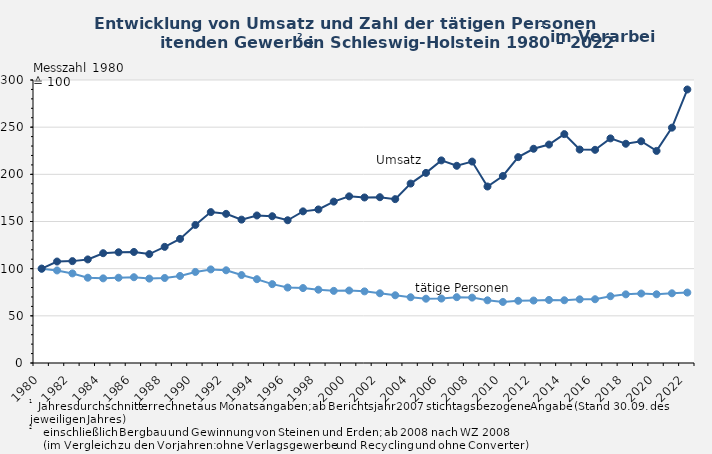
| Category | Tätige Personen1 | Umsatz |
|---|---|---|
| 1980.0 | 100 | 100 |
| 1981.0 | 98.106 | 107.568 |
| 1982.0 | 94.962 | 107.995 |
| 1983.0 | 90.416 | 109.798 |
| 1984.0 | 89.721 | 116.386 |
| 1985.0 | 90.376 | 117.395 |
| 1986.0 | 90.92 | 117.716 |
| 1987.0 | 89.463 | 115.449 |
| 1988.0 | 90.117 | 123.129 |
| 1989.0 | 92.291 | 131.587 |
| 1990.0 | 96.549 | 146.362 |
| 1991.0 | 99.203 | 159.964 |
| 1992.0 | 98.274 | 158.113 |
| 1993.0 | 93.239 | 151.97 |
| 1994.0 | 88.845 | 156.379 |
| 1995.0 | 83.59 | 155.59 |
| 1996.0 | 79.971 | 151.321 |
| 1997.0 | 79.412 | 160.744 |
| 1998.0 | 77.712 | 162.775 |
| 1999.0 | 76.47 | 171.068 |
| 2000.0 | 76.832 | 176.653 |
| 2001.0 | 75.937 | 175.47 |
| 2002.0 | 73.896 | 175.743 |
| 2003.0 | 71.797 | 173.711 |
| 2004.0 | 69.704 | 190.203 |
| 2005.0 | 68.176 | 201.527 |
| 2006.0 | 68.3 | 214.777 |
| 2007.0 | 69.773 | 209.05 |
| 2008.0 | 69.341 | 213.54 |
| 2009.0 | 66.462 | 187.094 |
| 2010.0 | 64.722 | 198.24 |
| 2011.0 | 65.943 | 218.24 |
| 2012.0 | 66.214 | 227.087 |
| 2013.0 | 66.845 | 231.584 |
| 2014.0 | 66.534 | 242.627 |
| 2015.0 | 67.501 | 226.266 |
| 2016.0 | 67.587 | 225.992 |
| 2017.0 | 70.811 | 238.094 |
| 2018.0 | 72.774 | 232.416 |
| 2019.0 | 73.648 | 235.061 |
| 2020.0 | 72.84 | 224.819 |
| 2021.0 | 73.887 | 249.485 |
| 2022.0 | 74.67 | 289.926 |